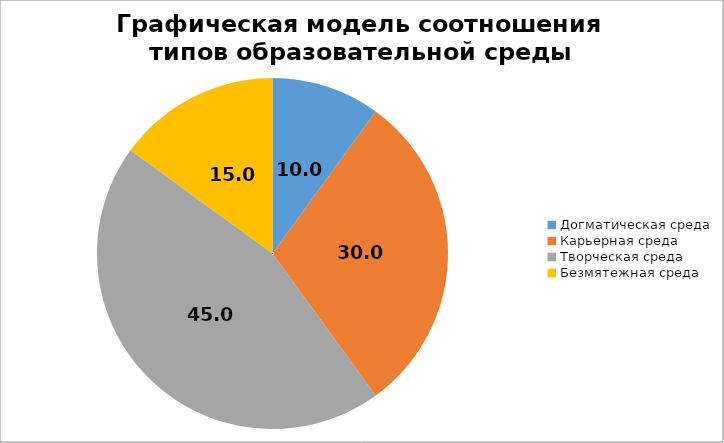
| Category | Графическая модель соотношения типов образовательной среды |
|---|---|
| Догматическая среда | 10 |
| Карьерная среда | 30 |
| Творческая среда | 45 |
| Безмятежная среда | 15 |